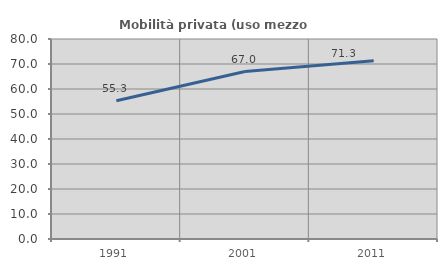
| Category | Mobilità privata (uso mezzo privato) |
|---|---|
| 1991.0 | 55.3 |
| 2001.0 | 66.976 |
| 2011.0 | 71.331 |